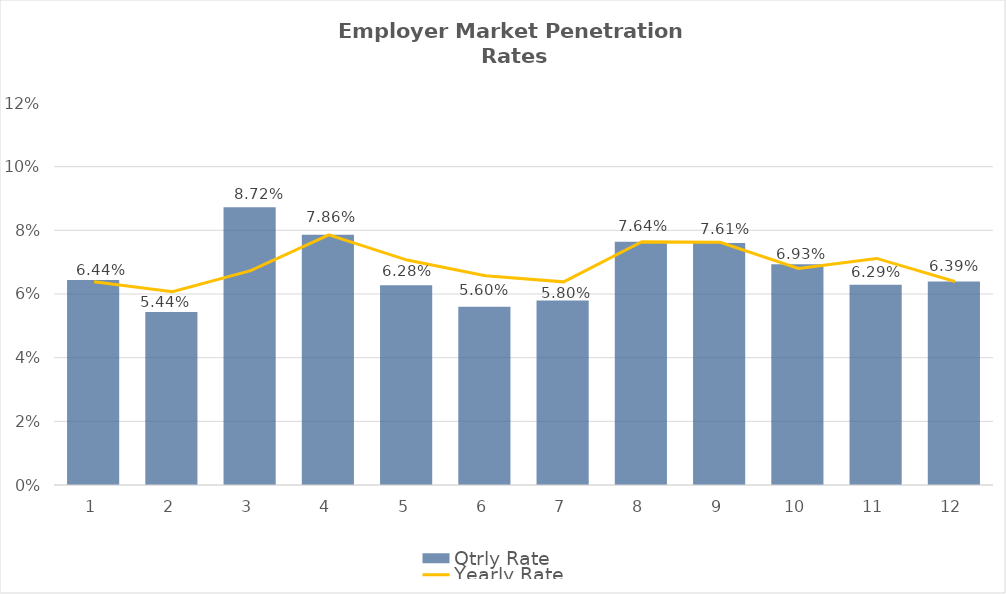
| Category | Qtrly Rate |
|---|---|
| 0 | 0.064 |
| 1 | 0.054 |
| 2 | 0.087 |
| 3 | 0.079 |
| 4 | 0.063 |
| 5 | 0.056 |
| 6 | 0.058 |
| 7 | 0.076 |
| 8 | 0.076 |
| 9 | 0.069 |
| 10 | 0.063 |
| 11 | 0.064 |